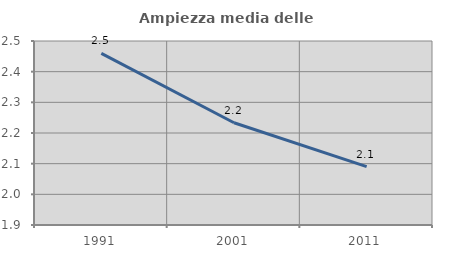
| Category | Ampiezza media delle famiglie |
|---|---|
| 1991.0 | 2.46 |
| 2001.0 | 2.233 |
| 2011.0 | 2.09 |